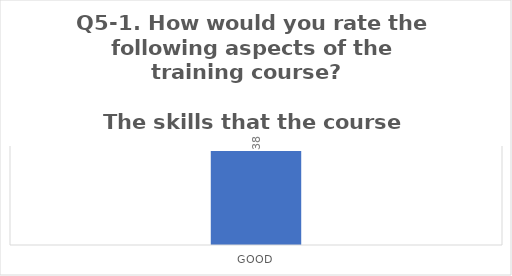
| Category | Q5-1. How would you rate the following aspects of the training course?  
 
The skills that the course teaches you |
|---|---|
| Good | 38 |